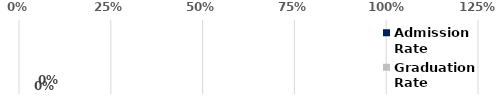
| Category | Admission
Rate | Graduation
Rate |
|---|---|---|
| Hispanic or Latinx | 0 | 0 |
| Not Hispanic or Latinx | 0 | 0 |
| Total | 0 | 0 |